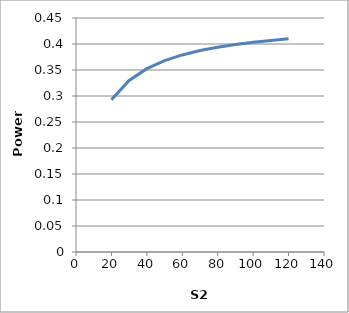
| Category | Series 0 |
|---|---|
| 20.0 | 0.293 |
| 30.0 | 0.33 |
| 40.0 | 0.353 |
| 50.0 | 0.368 |
| 60.0 | 0.379 |
| 70.0 | 0.387 |
| 80.0 | 0.394 |
| 90.0 | 0.399 |
| 100.0 | 0.403 |
| 110.0 | 0.407 |
| 120.0 | 0.41 |